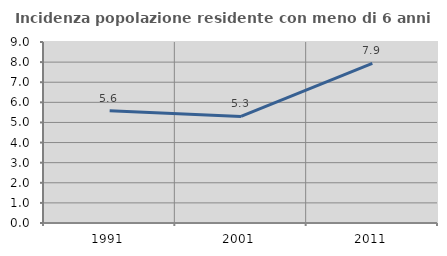
| Category | Incidenza popolazione residente con meno di 6 anni |
|---|---|
| 1991.0 | 5.58 |
| 2001.0 | 5.3 |
| 2011.0 | 7.941 |